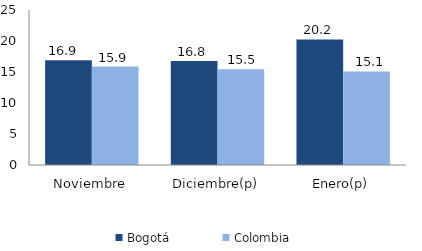
| Category | Bogotá | Colombia |
|---|---|---|
| Noviembre | 16.884 | 15.884 |
| Diciembre(p) | 16.771 | 15.453 |
| Enero(p) | 20.245 | 15.095 |